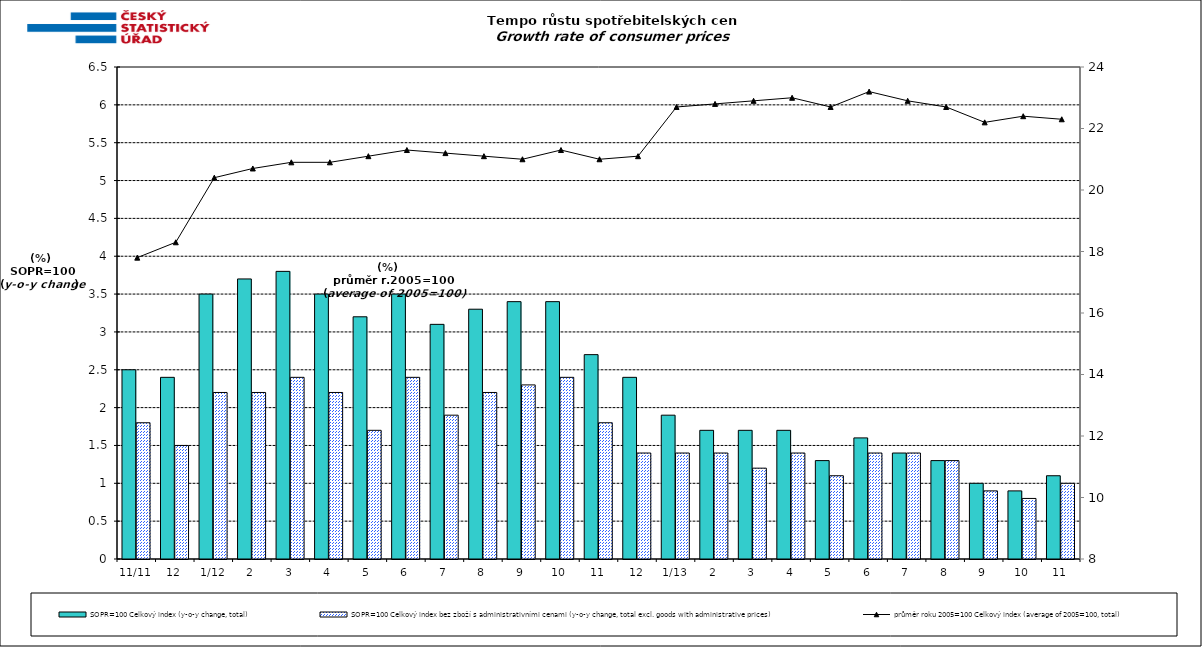
| Category | SOPR=100 Celkový index (y-o-y change, total) | SOPR=100 Celkový index bez zboží s administrativními cenami (y-o-y change, total excl. goods with administrative prices)  |
|---|---|---|
| 11/11 | 2.5 | 1.8 |
| 12 | 2.4 | 1.5 |
| 1/12 | 3.5 | 2.2 |
| 2 | 3.7 | 2.2 |
| 3 | 3.8 | 2.4 |
| 4 | 3.5 | 2.2 |
| 5 | 3.2 | 1.7 |
| 6 | 3.5 | 2.4 |
| 7 | 3.1 | 1.9 |
| 8 | 3.3 | 2.2 |
| 9 | 3.4 | 2.3 |
| 10 | 3.4 | 2.4 |
| 11 | 2.7 | 1.8 |
| 12 | 2.4 | 1.4 |
| 1/13 | 1.9 | 1.4 |
| 2 | 1.7 | 1.4 |
| 3 | 1.7 | 1.2 |
| 4 | 1.7 | 1.4 |
| 5 | 1.3 | 1.1 |
| 6 | 1.6 | 1.4 |
| 7 | 1.4 | 1.4 |
| 8 | 1.3 | 1.3 |
| 9 | 1 | 0.9 |
| 10 | 0.9 | 0.8 |
| 11 | 1.1 | 1 |